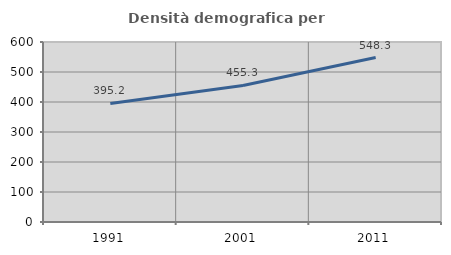
| Category | Densità demografica |
|---|---|
| 1991.0 | 395.206 |
| 2001.0 | 455.308 |
| 2011.0 | 548.303 |